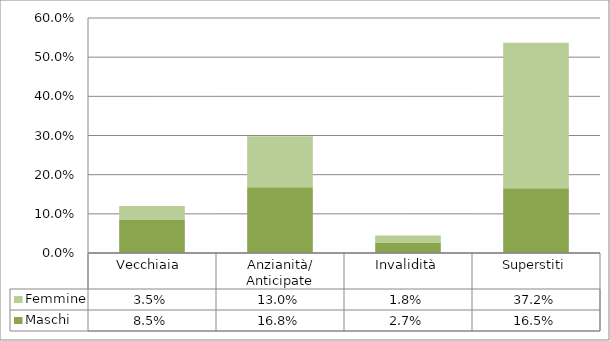
| Category | Maschi | Femmine |
|---|---|---|
| Vecchiaia  | 0.085 | 0.035 |
| Anzianità/ Anticipate | 0.168 | 0.13 |
| Invalidità | 0.027 | 0.018 |
| Superstiti | 0.165 | 0.372 |